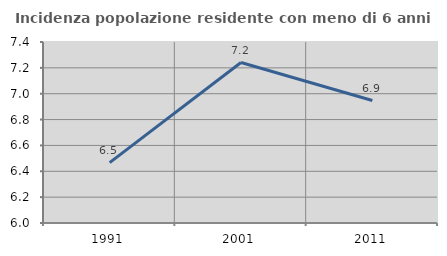
| Category | Incidenza popolazione residente con meno di 6 anni |
|---|---|
| 1991.0 | 6.467 |
| 2001.0 | 7.241 |
| 2011.0 | 6.947 |